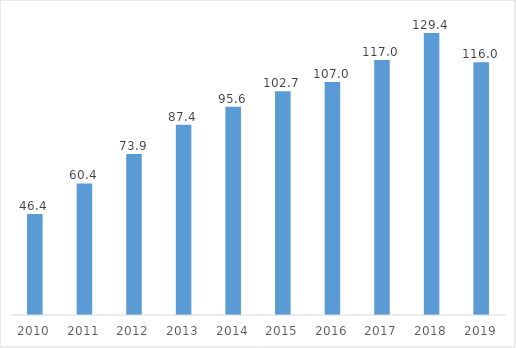
| Category | Series 0 |
|---|---|
| 2010.0 | 46.394 |
| 2011.0 | 60.414 |
| 2012.0 | 73.902 |
| 2013.0 | 87.377 |
| 2014.0 | 95.627 |
| 2015.0 | 102.744 |
| 2016.0 | 106.966 |
| 2017.0 | 117.024 |
| 2018.0 | 129.41 |
| 2019.0 | 116.022 |